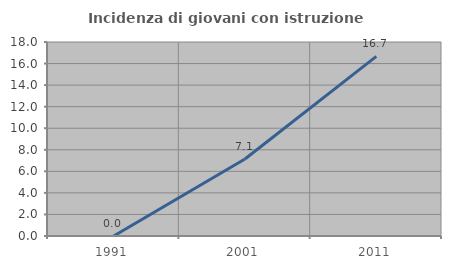
| Category | Incidenza di giovani con istruzione universitaria |
|---|---|
| 1991.0 | 0 |
| 2001.0 | 7.143 |
| 2011.0 | 16.667 |